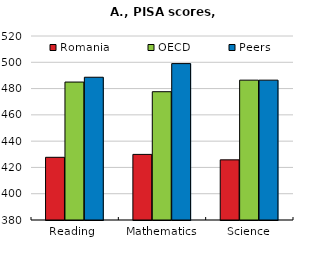
| Category | Romania | OECD | Peers |
|---|---|---|---|
| Reading  | 427.703 | 484.962 | 488.622 |
| Mathematics | 429.917 | 477.612 | 498.999 |
| Science | 425.761 | 486.406 | 486.406 |